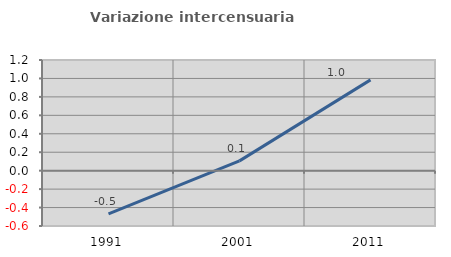
| Category | Variazione intercensuaria annua |
|---|---|
| 1991.0 | -0.468 |
| 2001.0 | 0.106 |
| 2011.0 | 0.984 |